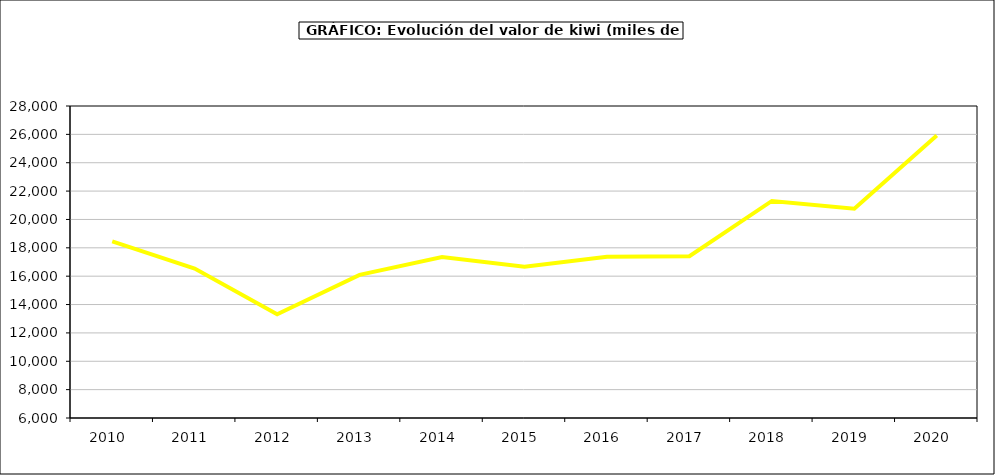
| Category | valor kiwi |
|---|---|
| 2010.0 | 18455.909 |
| 2011.0 | 16538.05 |
| 2012.0 | 13318.873 |
| 2013.0 | 16091.324 |
| 2014.0 | 17344.225 |
| 2015.0 | 16673 |
| 2016.0 | 17366 |
| 2017.0 | 17410.786 |
| 2018.0 | 21304.319 |
| 2019.0 | 20763.178 |
| 2020.0 | 25913.973 |